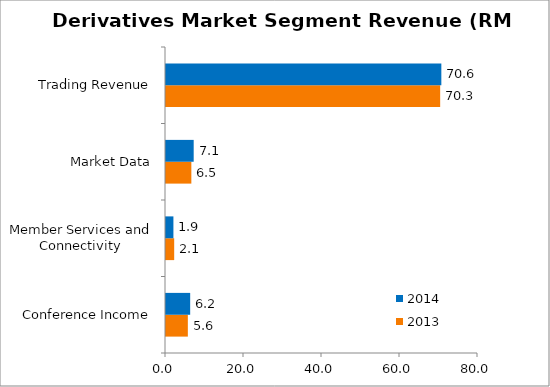
| Category | 2013 | 2014 |
|---|---|---|
| Conference Income | 5.6 | 6.2 |
| Member Services and Connectivity | 2.1 | 1.9 |
| Market Data | 6.5 | 7.1 |
| Trading Revenue | 70.3 | 70.6 |